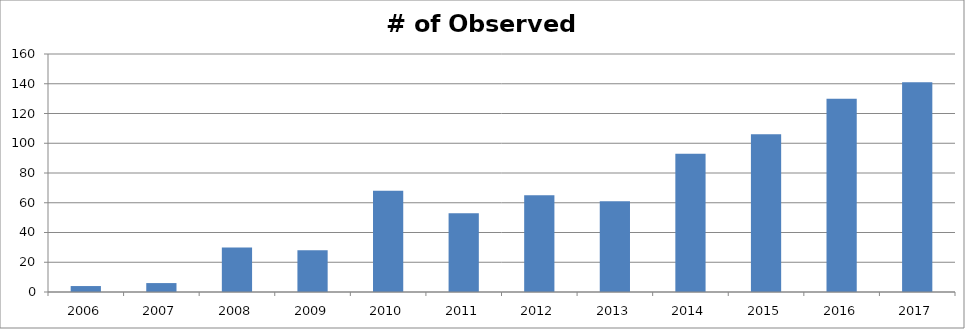
| Category | # of Observed Stands |
|---|---|
| 2006.0 | 4 |
| 2007.0 | 6 |
| 2008.0 | 30 |
| 2009.0 | 28 |
| 2010.0 | 68 |
| 2011.0 | 53 |
| 2012.0 | 65 |
| 2013.0 | 61 |
| 2014.0 | 93 |
| 2015.0 | 106 |
| 2016.0 | 130 |
| 2017.0 | 141 |